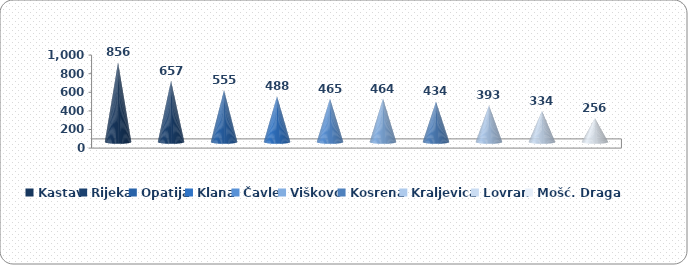
| Category | Produktivnost |
|---|---|
| Kastav | 856 |
| Rijeka | 657 |
| Opatija | 555.425 |
| Klana | 488.414 |
| Čavle | 464.85 |
| Viškovo | 464.106 |
| Kosrena | 434.124 |
| Kraljevica | 393.026 |
| Lovran | 333.882 |
| Mošć. Draga | 255.997 |